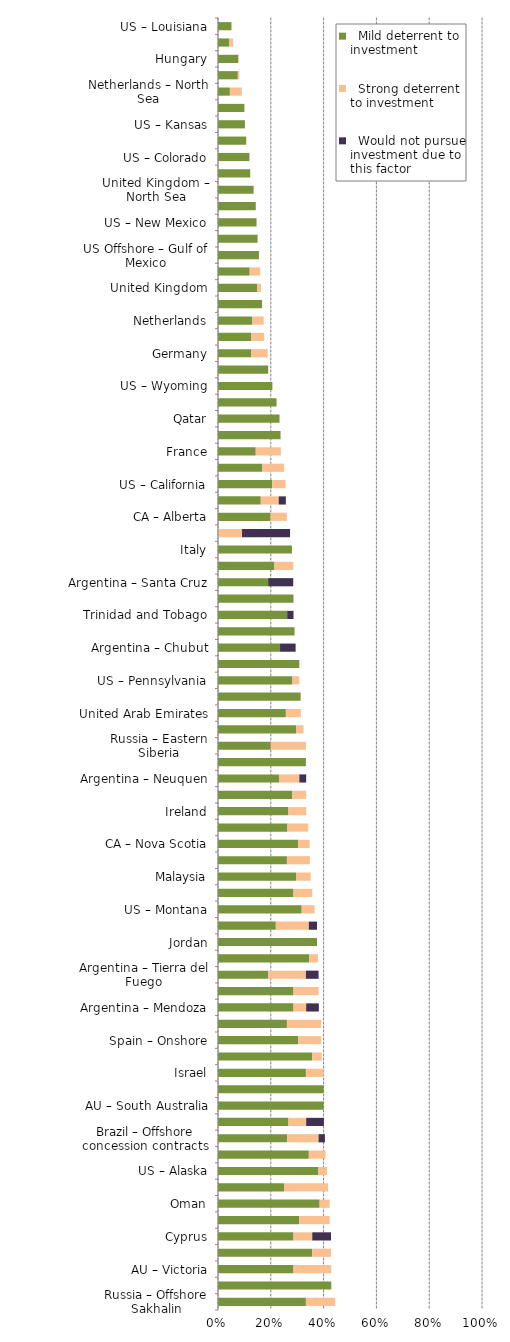
| Category |   Mild deterrent to investment |   Strong deterrent to investment |   Would not pursue investment due to this factor |
|---|---|---|---|
| Russia – Offshore Sakhalin | 0.333 | 0.111 | 0 |
| US Offshore – Pacific | 0.429 | 0 | 0 |
| AU – Victoria | 0.286 | 0.143 | 0 |
| AU – New South Wales | 0.357 | 0.071 | 0 |
| Cyprus | 0.286 | 0.071 | 0.071 |
| South Africa | 0.308 | 0.115 | 0 |
| Oman | 0.385 | 0.038 | 0 |
| Albania | 0.25 | 0.167 | 0 |
| US – Alaska | 0.379 | 0.034 | 0 |
| Russia – other | 0.344 | 0.063 | 0 |
| Brazil – Offshore concession contracts | 0.262 | 0.119 | 0.024 |
| Chile | 0.267 | 0.067 | 0.067 |
| AU – South Australia | 0.4 | 0 | 0 |
| Malta | 0.4 | 0 | 0 |
| Israel | 0.333 | 0.067 | 0 |
| Romania | 0.357 | 0.036 | 0 |
| Spain – Onshore | 0.304 | 0.087 | 0 |
| Morocco | 0.261 | 0.13 | 0 |
| Argentina – Mendoza | 0.286 | 0.048 | 0.048 |
| Spain – Offshore | 0.286 | 0.095 | 0 |
| Argentina – Tierra del Fuego | 0.19 | 0.143 | 0.048 |
| Turkey | 0.345 | 0.034 | 0 |
| Jordan | 0.375 | 0 | 0 |
| Brazil – Offshore presalt area profit sharing contracts | 0.219 | 0.125 | 0.031 |
| US – Montana | 0.317 | 0.049 | 0 |
| Ukraine | 0.286 | 0.071 | 0 |
| Malaysia | 0.297 | 0.054 | 0 |
| US – Michigan | 0.261 | 0.087 | 0 |
| CA – Nova Scotia | 0.304 | 0.043 | 0 |
| New Zealand | 0.263 | 0.079 | 0 |
| Ireland | 0.267 | 0.067 | 0 |
| Thailand | 0.281 | 0.053 | 0 |
| Argentina – Neuquen | 0.231 | 0.077 | 0.026 |
| CA – Newfoundland & Labrador | 0.333 | 0 | 0 |
| Russia – Eastern Siberia | 0.2 | 0.133 | 0 |
| CA – British Columbia | 0.297 | 0.027 | 0 |
| United Arab Emirates | 0.257 | 0.057 | 0 |
| US – Ohio | 0.313 | 0 | 0 |
| US – Pennsylvania | 0.282 | 0.026 | 0 |
| Kuwait | 0.308 | 0 | 0 |
| Argentina – Chubut | 0.235 | 0 | 0.059 |
| US – Utah | 0.29 | 0 | 0 |
| Trinidad and Tobago | 0.262 | 0 | 0.024 |
| US – West Virginia | 0.286 | 0 | 0 |
| Argentina – Santa Cruz | 0.19 | 0 | 0.095 |
| US Offshore – Alaska | 0.214 | 0.071 | 0 |
| Italy | 0.28 | 0 | 0 |
| Greece | 0 | 0.091 | 0.182 |
| CA – Alberta | 0.199 | 0.062 | 0 |
| Colombia | 0.162 | 0.068 | 0.027 |
| US – California | 0.205 | 0.051 | 0 |
| Bahrain | 0.167 | 0.083 | 0 |
| France | 0.143 | 0.095 | 0 |
| CA – Saskatchewan | 0.237 | 0 | 0 |
| Qatar | 0.233 | 0 | 0 |
| Denmark | 0.222 | 0 | 0 |
| US – Wyoming | 0.206 | 0 | 0 |
| CA – Manitoba | 0.19 | 0 | 0 |
| Germany | 0.125 | 0.063 | 0 |
| Norway – North Sea | 0.125 | 0.05 | 0 |
| Netherlands | 0.13 | 0.043 | 0 |
| Japan | 0.167 | 0 | 0 |
| United Kingdom | 0.149 | 0.014 | 0 |
| US – Alabama | 0.12 | 0.04 | 0 |
| US Offshore – Gulf of Mexico | 0.155 | 0 | 0 |
| US – Illinois | 0.15 | 0 | 0 |
| US – New Mexico | 0.146 | 0 | 0 |
| Poland | 0.143 | 0 | 0 |
| United Kingdom – North Sea | 0.135 | 0 | 0 |
| Norway | 0.122 | 0 | 0 |
| US – Colorado | 0.119 | 0 | 0 |
| US – Arkansas | 0.107 | 0 | 0 |
| US – Kansas | 0.102 | 0 | 0 |
| US – Mississippi | 0.1 | 0 | 0 |
| Netherlands – North Sea | 0.045 | 0.045 | 0 |
| US – Texas | 0.075 | 0.006 | 0 |
| Hungary | 0.077 | 0 | 0 |
| US – Oklahoma | 0.043 | 0.014 | 0 |
| US – Louisiana | 0.051 | 0 | 0 |